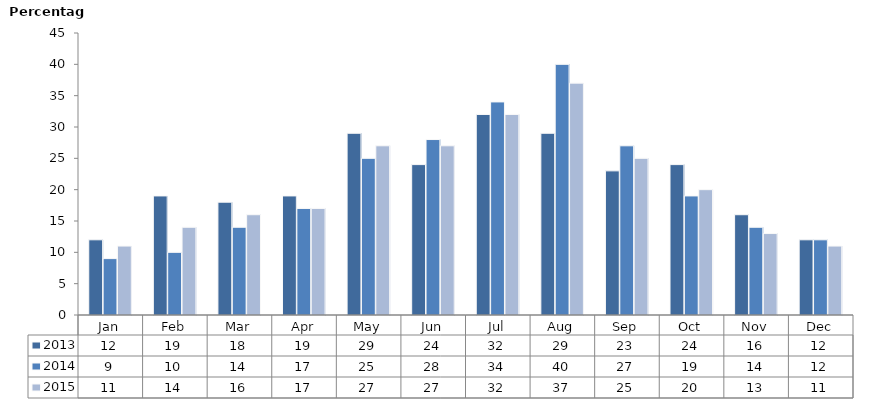
| Category | 2013 | 2014 | 2015 |
|---|---|---|---|
| Jan | 12 | 9 | 11 |
| Feb | 19 | 10 | 14 |
| Mar | 18 | 14 | 16 |
| Apr | 19 | 17 | 17 |
| May | 29 | 25 | 27 |
| Jun | 24 | 28 | 27 |
| Jul | 32 | 34 | 32 |
| Aug | 29 | 40 | 37 |
| Sep | 23 | 27 | 25 |
| Oct | 24 | 19 | 20 |
| Nov | 16 | 14 | 13 |
| Dec | 12 | 12 | 11 |